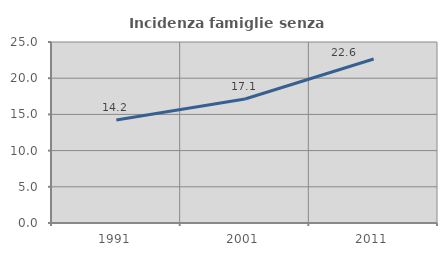
| Category | Incidenza famiglie senza nuclei |
|---|---|
| 1991.0 | 14.237 |
| 2001.0 | 17.125 |
| 2011.0 | 22.649 |